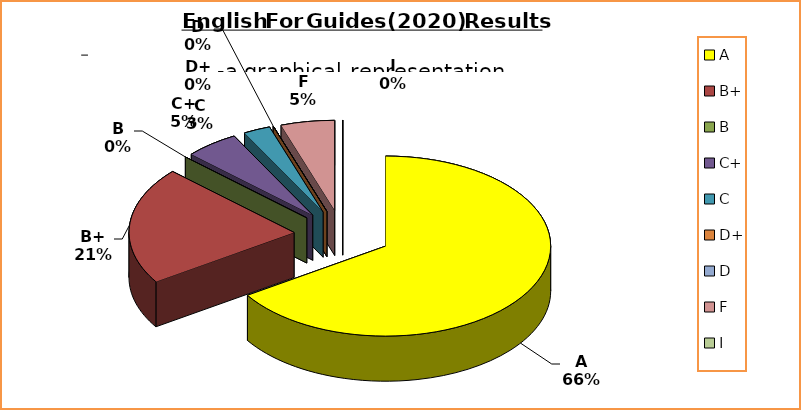
| Category | Series 0 |
|---|---|
| A | 25 |
| B+ | 8 |
| B | 0 |
| C+ | 2 |
| C | 1 |
| D+ | 0 |
| D | 0 |
| F | 2 |
| I | 0 |